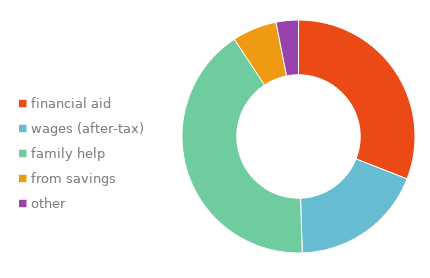
| Category | Series 0 |
|---|---|
| 0 | 0.309 |
| 1 | 0.186 |
| 2 | 0.412 |
| 3 | 0.062 |
| 4 | 0.031 |